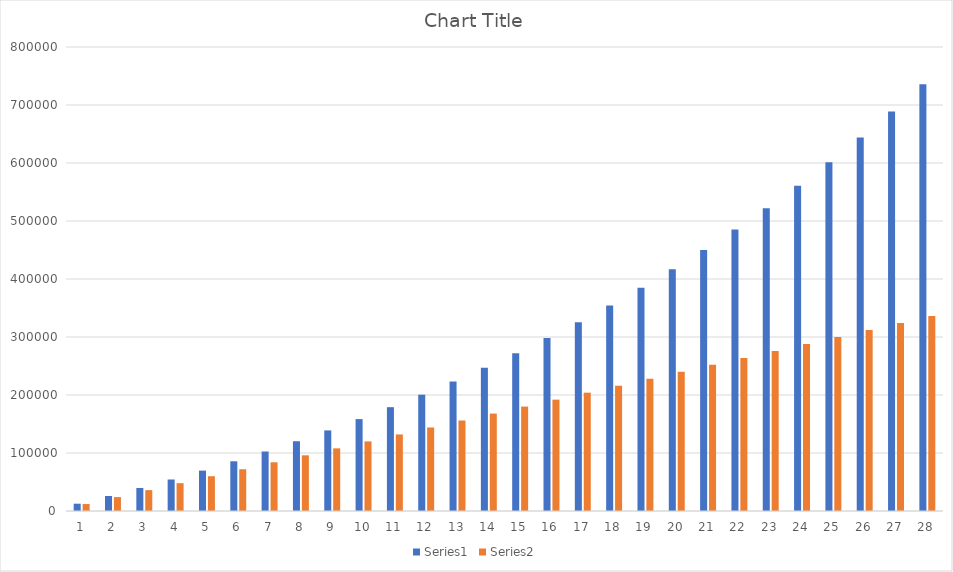
| Category | Series 0 | Series 1 |
|---|---|---|
| 0 | 12600 | 12000 |
| 1 | 25830 | 24000 |
| 2 | 39722 | 36000 |
| 3 | 54308 | 48000 |
| 4 | 69623 | 60000 |
| 5 | 85704 | 72000 |
| 6 | 102589 | 84000 |
| 7 | 120318 | 96000 |
| 8 | 138934 | 108000 |
| 9 | 158481 | 120000 |
| 10 | 179005 | 132000 |
| 11 | 200555 | 144000 |
| 12 | 223183 | 156000 |
| 13 | 246942 | 168000 |
| 14 | 271889 | 180000 |
| 15 | 298083 | 192000 |
| 16 | 325587 | 204000 |
| 17 | 354466 | 216000 |
| 18 | 384789 | 228000 |
| 19 | 416628 | 240000 |
| 20 | 450059 | 252000 |
| 21 | 485162 | 264000 |
| 22 | 522020 | 276000 |
| 23 | 560721 | 288000 |
| 24 | 601357 | 300000 |
| 25 | 644025 | 312000 |
| 26 | 688826 | 324000 |
| 27 | 735867 | 336000 |